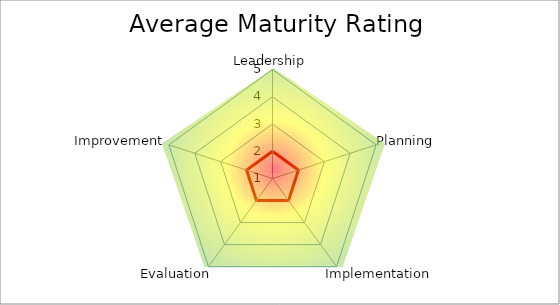
| Category | Average |
|---|---|
| Leadership | 0 |
| Planning | 0 |
| Implementation | 0 |
| Evaluation | 0 |
| Improvement | 0 |